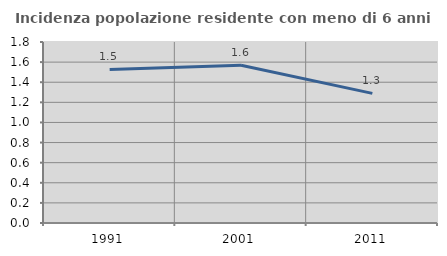
| Category | Incidenza popolazione residente con meno di 6 anni |
|---|---|
| 1991.0 | 1.527 |
| 2001.0 | 1.568 |
| 2011.0 | 1.289 |